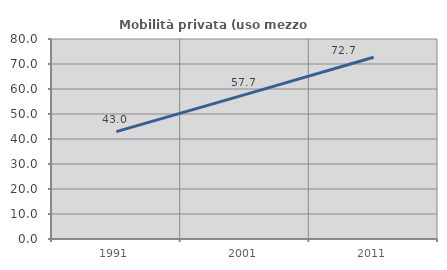
| Category | Mobilità privata (uso mezzo privato) |
|---|---|
| 1991.0 | 42.963 |
| 2001.0 | 57.733 |
| 2011.0 | 72.69 |